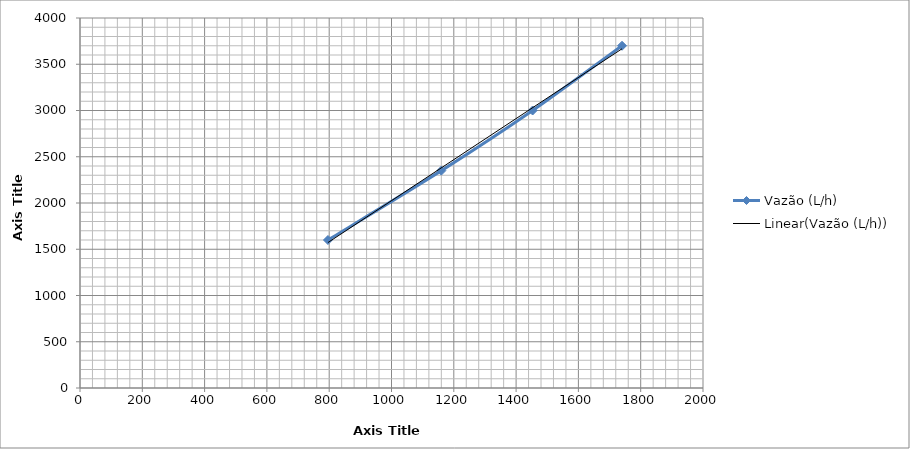
| Category | Vazão (L/h) |
|---|---|
| 1740.0 | 3700 |
| 1453.0 | 3000 |
| 1160.0 | 2350 |
| 796.0 | 1600 |